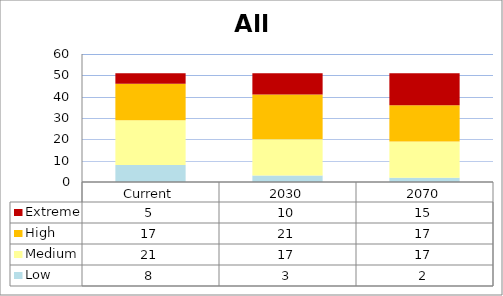
| Category | Low | Medium | High | Extreme |
|---|---|---|---|---|
| Current | 8 | 21 | 17 | 5 |
| 2030 | 3 | 17 | 21 | 10 |
| 2070 | 2 | 17 | 17 | 15 |